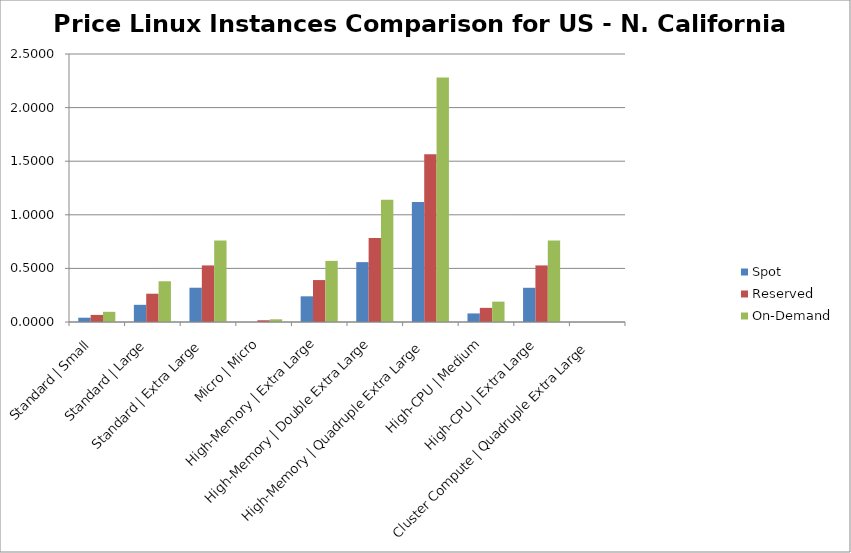
| Category | Spot | Reserved | On-Demand |
|---|---|---|---|
| Standard | Small | 0.04 | 0.066 | 0.095 |
| Standard | Large | 0.16 | 0.264 | 0.38 |
| Standard | Extra Large | 0.32 | 0.528 | 0.76 |
| Micro | Micro | 0 | 0.016 | 0.025 |
| High-Memory | Extra Large | 0.24 | 0.391 | 0.57 |
| High-Memory | Double Extra Large | 0.559 | 0.783 | 1.14 |
| High-Memory | Quadruple Extra Large | 1.119 | 1.565 | 2.28 |
| High-CPU | Medium | 0.08 | 0.132 | 0.19 |
| High-CPU | Extra Large | 0.319 | 0.528 | 0.76 |
| Cluster Compute | Quadruple Extra Large | 0 | 0 | 0 |